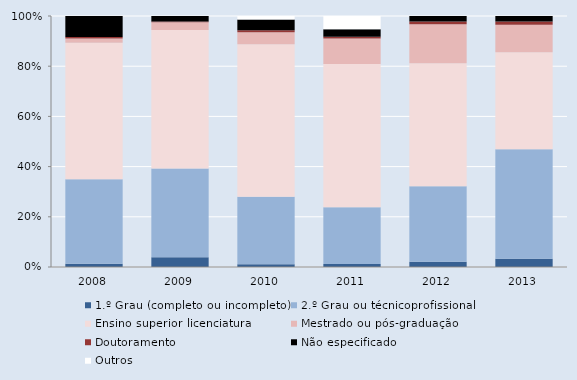
| Category | 1.º Grau (completo ou incompleto) | 2.º Grau ou técnicoprofissional | Ensino superior licenciatura | Mestrado ou pós-graduação | Doutoramento | Não especificado | Outros |
|---|---|---|---|---|---|---|---|
| 2008.0 | 9 | 233 | 376 | 12 | 4 | 58 | 0 |
| 2009.0 | 28 | 254 | 396 | 22 | 2 | 16 | 0 |
| 2010.0 | 9 | 219 | 494 | 39 | 7 | 35 | 11 |
| 2011.0 | 19 | 361 | 914 | 161 | 12 | 48 | 84 |
| 2012.0 | 46 | 676 | 1103 | 348 | 24 | 49 | 1 |
| 2013.0 | 80 | 1074 | 951 | 269 | 30 | 55 | 0 |